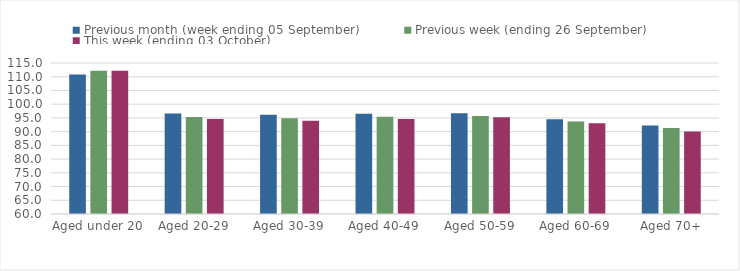
| Category | Previous month (week ending 05 September) | Previous week (ending 26 September) | This week (ending 03 October) |
|---|---|---|---|
| Aged under 20 | 110.82 | 112.22 | 112.18 |
| Aged 20-29 | 96.62 | 95.33 | 94.64 |
| Aged 30-39 | 96.16 | 94.85 | 93.99 |
| Aged 40-49 | 96.54 | 95.4 | 94.64 |
| Aged 50-59 | 96.72 | 95.74 | 95.22 |
| Aged 60-69 | 94.53 | 93.66 | 93.01 |
| Aged 70+ | 92.2 | 91.35 | 90.06 |